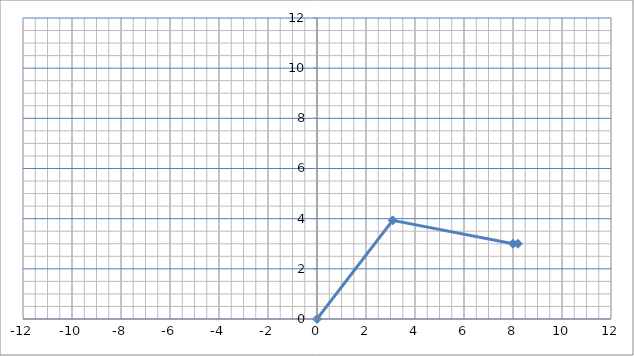
| Category | y |
|---|---|
| 0.0 | 0 |
| 3.0877545391606946 | 3.933 |
| 8.0 | 3 |
| 8.2 | 3 |